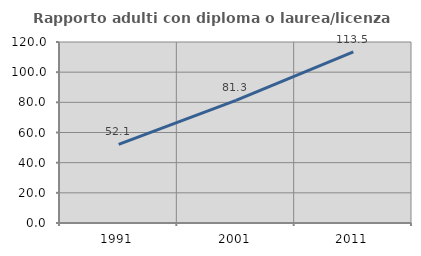
| Category | Rapporto adulti con diploma o laurea/licenza media  |
|---|---|
| 1991.0 | 52.126 |
| 2001.0 | 81.34 |
| 2011.0 | 113.482 |